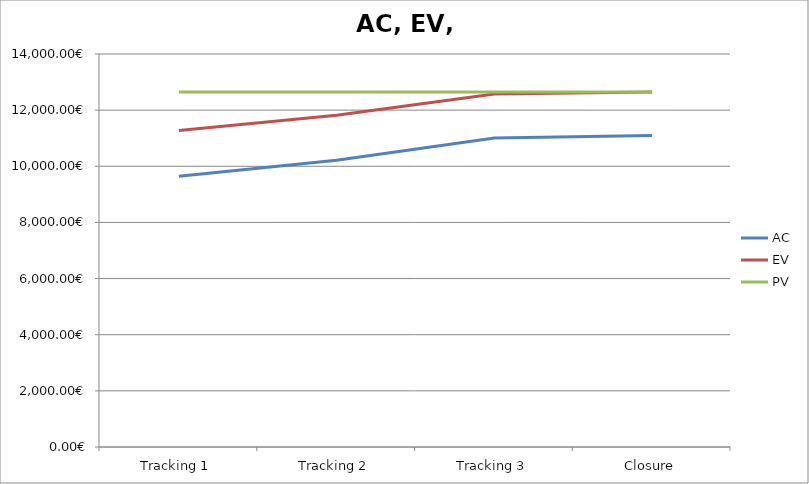
| Category | AC | EV | PV |
|---|---|---|---|
| Tracking 1 | 9645 | 11278.5 | 12645 |
| Tracking 2 | 10215 | 11817.6 | 12645 |
| Tracking 3 | 11010 | 12573 | 12645 |
| Closure | 11100 | 12645 | 12645 |